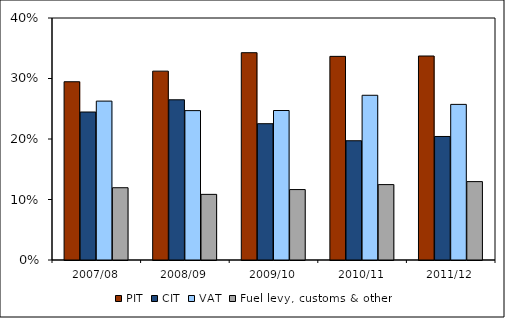
| Category | PIT | CIT | VAT | Fuel levy, customs & other |
|---|---|---|---|---|
| 2007/08 | 0.295 | 0.245 | 0.263 | 0.119 |
| 2008/09 | 0.312 | 0.265 | 0.247 | 0.108 |
| 2009/10 | 0.343 | 0.225 | 0.247 | 0.116 |
| 2010/11 | 0.337 | 0.197 | 0.272 | 0.125 |
| 2011/12 | 0.337 | 0.204 | 0.257 | 0.13 |